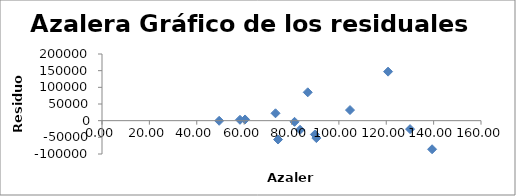
| Category | Series 0 |
|---|---|
| 49.47 | -348.981 |
| 58.25 | 2647.91 |
| 60.39 | 3620 |
| 73.25 | 22156.95 |
| 74.32 | -56557.005 |
| 81.29 | -3469.404 |
| 83.61 | -27357.606 |
| 86.86 | 85109.353 |
| 89.88 | -41324.427 |
| 90.49 | -52239.86 |
| 104.7 | 31844.904 |
| 120.77 | 147039.989 |
| 130.06 | -25360.612 |
| 139.35 | -85761.213 |